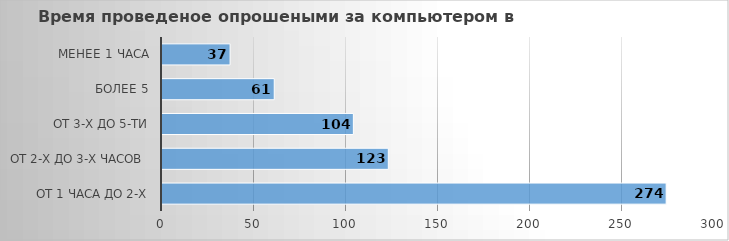
| Category | Series 0 |
|---|---|
| от 1 часа до 2-х | 274 |
| от 2-х до 3-х часов  | 123 |
| от 3-х до 5-ти | 104 |
| более 5 | 61 |
| менее 1 часа | 37 |